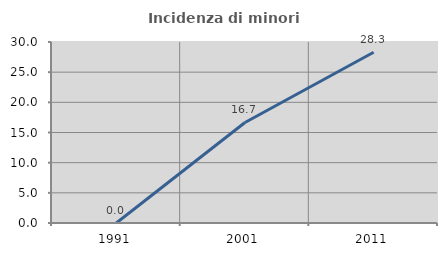
| Category | Incidenza di minori stranieri |
|---|---|
| 1991.0 | 0 |
| 2001.0 | 16.667 |
| 2011.0 | 28.302 |